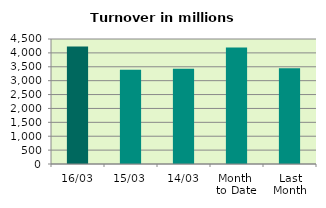
| Category | Series 0 |
|---|---|
| 16/03 | 4231.306 |
| 15/03 | 3388.838 |
| 14/03 | 3425.818 |
| Month 
to Date | 4194.929 |
| Last
Month | 3445.759 |